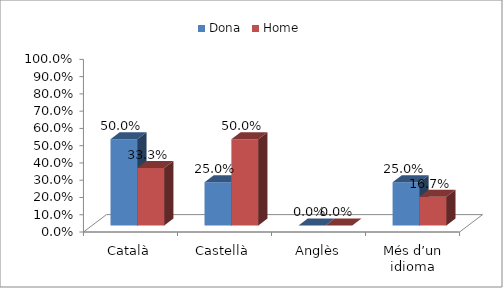
| Category | Dona | Home |
|---|---|---|
| Català | 0.5 | 0.333 |
| Castellà | 0.25 | 0.5 |
| Anglès | 0 | 0 |
| Més d’un idioma | 0.25 | 0.167 |